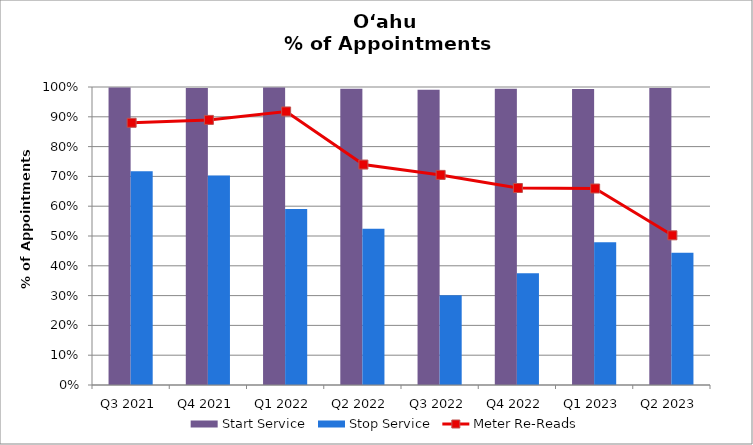
| Category | Start Service | Stop Service |
|---|---|---|
| Q3 2021 | 0.998 | 0.717 |
| Q4 2021 | 0.997 | 0.703 |
| Q1 2022 | 0.998 | 0.59 |
| Q2 2022 | 0.994 | 0.525 |
| Q3 2022 | 0.991 | 0.301 |
| Q4 2022 | 0.994 | 0.375 |
| Q1 2023 | 0.994 | 0.479 |
| Q2 2023 | 0.997 | 0.444 |